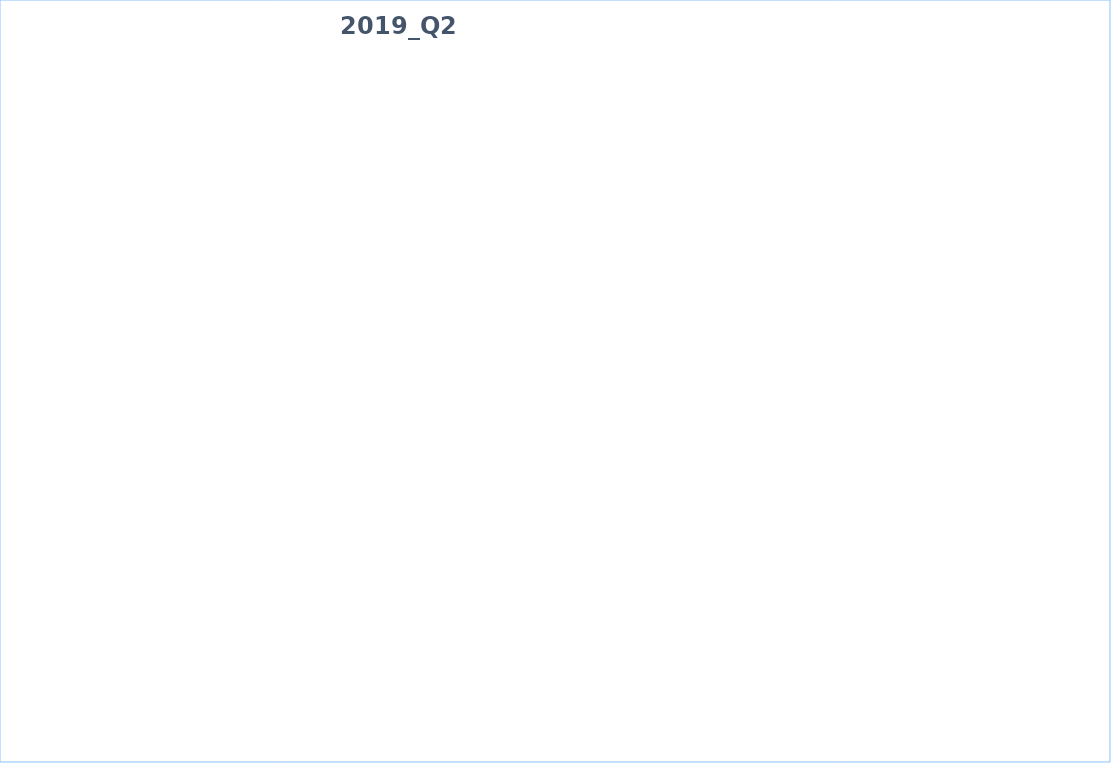
| Category | Total Population | Number of People adopt basic personal and community hygiene practices | Number of people with equitable and continuous access to safe sanitation facilities | Number of people with equitable and continuous access to sufficient quantity of domestic water |
|---|---|---|---|---|
| 0 | 979 | 979 | 979 | 979 |
| 1 | 581 | 0 | 581 | 581 |
| 2 | 2920 | 2920 | 2920 | 2920 |
| 3 | 22313 | 22313 | 15961 | 17494.493 |
| 4 | 92327 | 92111 | 70207 | 92327 |